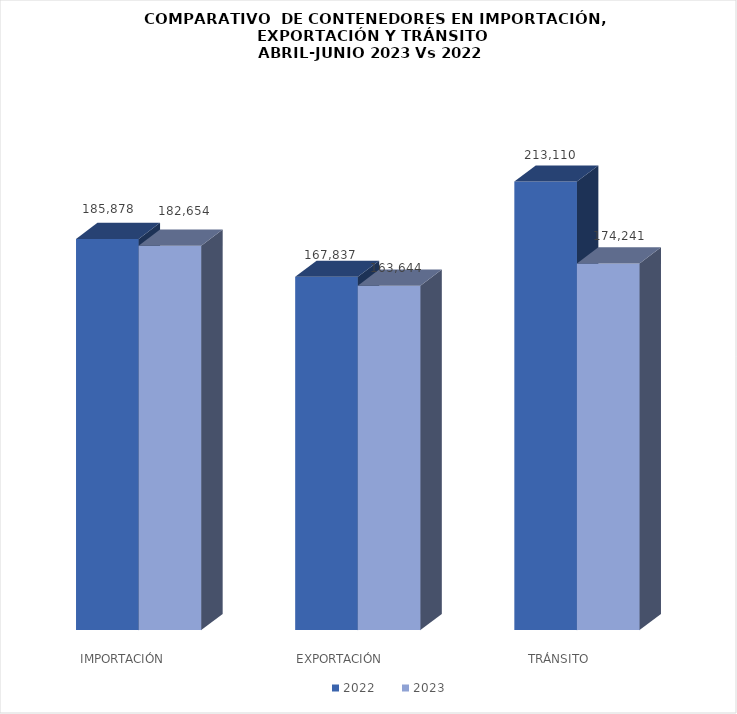
| Category | 2022 | 2023 |
|---|---|---|
|  IMPORTACIÓN | 185878 | 182654 |
| EXPORTACIÓN | 167837 | 163644 |
| TRÁNSITO | 213110 | 174241.25 |